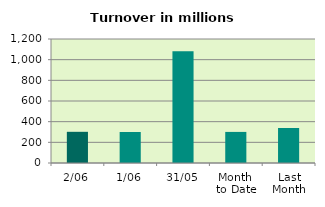
| Category | Series 0 |
|---|---|
| 2/06 | 301.818 |
| 1/06 | 299.926 |
| 31/05 | 1080.623 |
| Month 
to Date | 300.872 |
| Last
Month | 338.969 |